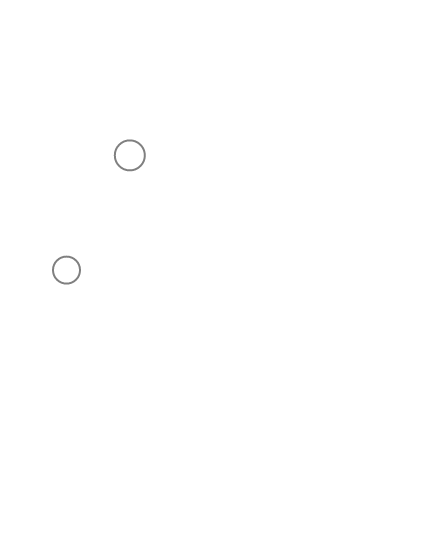
| Category | Delhi |
|---|---|
| 77.12 | 28.38 |
| 73.16 | 22 |
| 0.0 | 0 |